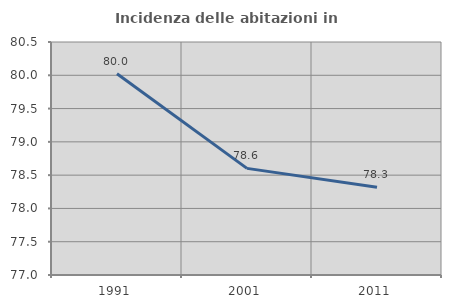
| Category | Incidenza delle abitazioni in proprietà  |
|---|---|
| 1991.0 | 80.023 |
| 2001.0 | 78.602 |
| 2011.0 | 78.317 |